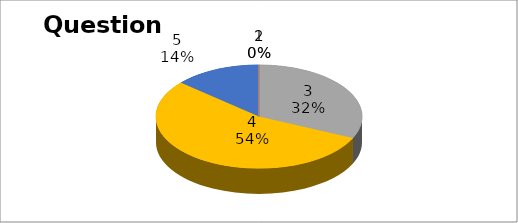
| Category | Series 0 |
|---|---|
| 0 | 0 |
| 1 | 0 |
| 2 | 7 |
| 3 | 12 |
| 4 | 3 |